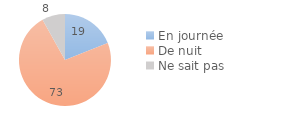
| Category | Series 0 |
|---|---|
| En journée | 18.994 |
| De nuit | 72.897 |
| Ne sait pas | 8.109 |